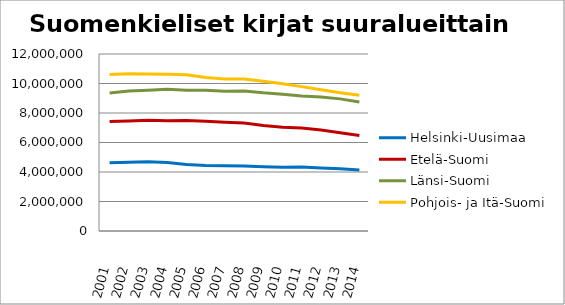
| Category | Helsinki-Uusimaa | Etelä-Suomi | Länsi-Suomi | Pohjois- ja Itä-Suomi |
|---|---|---|---|---|
| 2001.0 | 4625244 | 7427465 | 9358423 | 10606272 |
| 2002.0 | 4658533 | 7465703 | 9485230 | 10656582 |
| 2003.0 | 4697086 | 7504008 | 9540448 | 10639796 |
| 2004.0 | 4640442 | 7474227 | 9605493 | 10624606 |
| 2005.0 | 4503772 | 7493954 | 9547980 | 10588069 |
| 2006.0 | 4439374 | 7439095 | 9548500 | 10407988 |
| 2007.0 | 4424047 | 7376444 | 9469001 | 10311653 |
| 2008.0 | 4404387 | 7322106 | 9494154 | 10300192 |
| 2009.0 | 4362525 | 7153120 | 9365936 | 10154533 |
| 2010.0 | 4326755 | 7029263 | 9272679 | 9987277 |
| 2011.0 | 4337050 | 6977343 | 9155269 | 9788194 |
| 2012.0 | 4264335 | 6840390 | 9081780 | 9574874 |
| 2013.0 | 4220286 | 6667938 | 8957594 | 9377468 |
| 2014.0 | 4140233 | 6479472 | 8742856 | 9197948 |